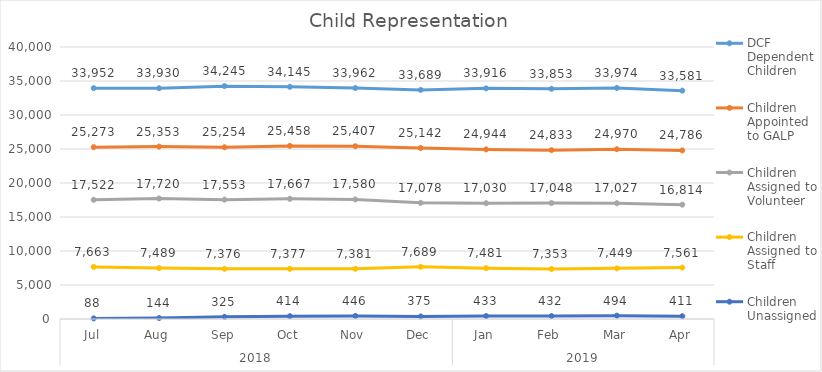
| Category | DCF Dependent Children  | Children Appointed to GALP  | Children Assigned to Volunteer  | Children Assigned to Staff  | Children Unassigned  |
|---|---|---|---|---|---|
| 0 | 33952 | 25273 | 17522 | 7663 | 88 |
| 1 | 33930 | 25353 | 17720 | 7489 | 144 |
| 2 | 34245 | 25254 | 17553 | 7376 | 325 |
| 3 | 34145 | 25458 | 17667 | 7377 | 414 |
| 4 | 33962 | 25407 | 17580 | 7381 | 446 |
| 5 | 33689 | 25142 | 17078 | 7689 | 375 |
| 6 | 33916 | 24944 | 17030 | 7481 | 433 |
| 7 | 33853 | 24833 | 17048 | 7353 | 432 |
| 8 | 33974 | 24970 | 17027 | 7449 | 494 |
| 9 | 33581 | 24786 | 16814 | 7561 | 411 |